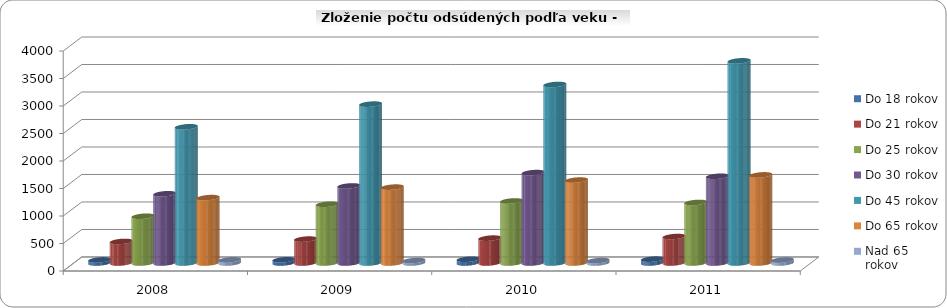
| Category | Do 18 rokov | Do 21 rokov | Do 25 rokov | Do 30 rokov | Do 45 rokov | Do 65 rokov | Nad 65 rokov |
|---|---|---|---|---|---|---|---|
| 2008.0 | 56 | 392 | 850 | 1259 | 2477 | 1189 | 57 |
| 2009.0 | 59 | 435 | 1068 | 1401 | 2889 | 1380 | 45 |
| 2010.0 | 68 | 452 | 1128 | 1644 | 3246 | 1508 | 44 |
| 2011.0 | 70 | 481 | 1101 | 1577 | 3676 | 1602 | 53 |